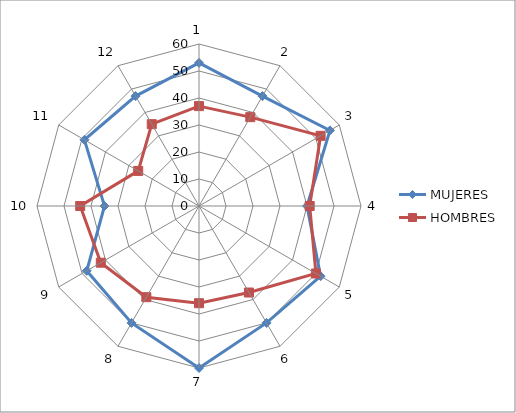
| Category | MUJERES | HOMBRES |
|---|---|---|
| 0 | 53 | 37 |
| 1 | 47 | 38 |
| 2 | 56 | 52 |
| 3 | 40 | 41 |
| 4 | 52 | 50 |
| 5 | 50 | 37 |
| 6 | 60 | 36 |
| 7 | 50 | 39 |
| 8 | 48 | 42 |
| 9 | 35 | 44 |
| 10 | 49 | 26 |
| 11 | 47 | 35 |